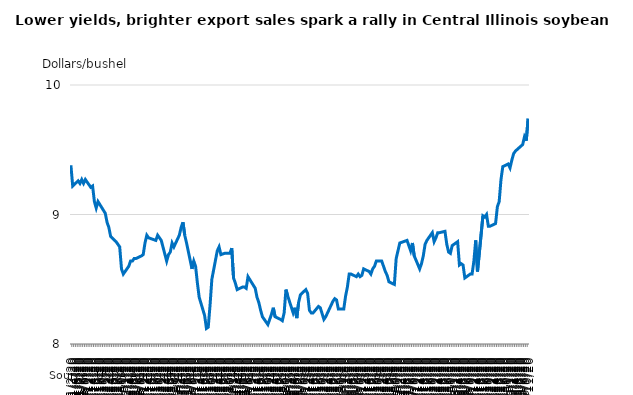
| Category | Series 0 |
|---|---|
| 1/2/20 | 9.38 |
| 1/3/20 | 9.22 |
| 1/6/20 | 9.26 |
| 1/7/20 | 9.24 |
| 1/8/20 | 9.27 |
| 1/9/20 | 9.24 |
| 1/10/20 | 9.27 |
| 1/13/20 | 9.21 |
| 1/14/20 | 9.22 |
| 1/15/20 | 9.1 |
| 1/16/20 | 9.05 |
| 1/17/20 | 9.1 |
| 1/21/20 | 9.01 |
| 1/22/20 | 8.94 |
| 1/23/20 | 8.9 |
| 1/24/20 | 8.83 |
| 1/27/20 | 8.79 |
| 1/28/20 | 8.77 |
| 1/29/20 | 8.75 |
| 1/30/20 | 8.58 |
| 1/31/20 | 8.54 |
| 2/3/20 | 8.6 |
| 2/4/20 | 8.64 |
| 2/5/20 | 8.64 |
| 2/6/20 | 8.66 |
| 2/7/20 | 8.66 |
| 2/10/20 | 8.68 |
| 2/11/20 | 8.69 |
| 2/12/20 | 8.78 |
| 2/13/20 | 8.84 |
| 2/14/20 | 8.82 |
| 2/18/20 | 8.8 |
| 2/19/20 | 8.84 |
| 2/20/20 | 8.82 |
| 2/21/20 | 8.8 |
| 2/24/20 | 8.64 |
| 2/25/20 | 8.69 |
| 2/26/20 | 8.71 |
| 2/27/20 | 8.78 |
| 2/28/20 | 8.75 |
| 3/2/20 | 8.84 |
| 3/3/20 | 8.9 |
| 3/4/20 | 8.94 |
| 3/5/20 | 8.84 |
| 3/6/20 | 8.78 |
| 3/9/20 | 8.58 |
| 3/10/20 | 8.64 |
| 3/11/20 | 8.6 |
| 3/12/20 | 8.47 |
| 3/13/20 | 8.36 |
| 3/16/20 | 8.22 |
| 3/17/20 | 8.12 |
| 3/18/20 | 8.13 |
| 3/19/20 | 8.3 |
| 3/20/20 | 8.5 |
| 3/23/20 | 8.72 |
| 3/24/20 | 8.75 |
| 3/25/20 | 8.69 |
| 3/27/20 | 8.7 |
| 3/30/20 | 8.7 |
| 3/31/20 | 8.74 |
| 4/1/20 | 8.51 |
| 4/2/20 | 8.47 |
| 4/3/20 | 8.42 |
| 4/6/20 | 8.44 |
| 4/7/20 | 8.44 |
| 4/8/20 | 8.43 |
| 4/9/20 | 8.52 |
| 4/13/20 | 8.43 |
| 4/14/20 | 8.36 |
| 4/15/20 | 8.32 |
| 4/16/20 | 8.26 |
| 4/17/20 | 8.21 |
| 4/20/20 | 8.15 |
| 4/21/20 | 8.19 |
| 4/22/20 | 8.23 |
| 4/23/20 | 8.28 |
| 4/24/20 | 8.21 |
| 4/27/20 | 8.19 |
| 4/28/20 | 8.18 |
| 4/29/20 | 8.24 |
| 4/30/20 | 8.42 |
| 5/1/20 | 8.37 |
| 5/4/20 | 8.24 |
| 5/5/20 | 8.28 |
| 5/6/20 | 8.2 |
| 5/7/20 | 8.32 |
| 5/8/20 | 8.38 |
| 5/11/20 | 8.42 |
| 5/12/20 | 8.39 |
| 5/13/20 | 8.26 |
| 5/14/20 | 8.24 |
| 5/15/20 | 8.24 |
| 5/18/20 | 8.29 |
| 5/19/20 | 8.28 |
| 5/21/20 | 8.19 |
| 5/22/20 | 8.21 |
| 5/26/20 | 8.33 |
| 5/27/20 | 8.35 |
| 5/28/20 | 8.34 |
| 5/29/20 | 8.27 |
| 6/1/20 | 8.27 |
| 6/2/20 | 8.37 |
| 6/3/20 | 8.44 |
| 6/4/20 | 8.54 |
| 6/5/20 | 8.54 |
| 6/8/20 | 8.52 |
| 6/9/20 | 8.54 |
| 6/10/20 | 8.52 |
| 6/11/20 | 8.53 |
| 6/12/20 | 8.58 |
| 6/15/20 | 8.56 |
| 6/16/20 | 8.54 |
| 6/17/20 | 8.58 |
| 6/18/20 | 8.6 |
| 6/19/20 | 8.64 |
| 6/22/20 | 8.64 |
| 6/23/20 | 8.6 |
| 6/24/20 | 8.56 |
| 6/25/20 | 8.53 |
| 6/26/20 | 8.48 |
| 6/29/20 | 8.46 |
| 6/30/20 | 8.66 |
| 7/1/20 | 8.72 |
| 7/2/20 | 8.78 |
| 7/6/20 | 8.8 |
| 7/7/20 | 8.76 |
| 7/8/20 | 8.72 |
| 7/9/20 | 8.78 |
| 7/10/20 | 8.68 |
| 7/13/20 | 8.58 |
| 7/14/20 | 8.62 |
| 7/15/20 | 8.68 |
| 7/16/20 | 8.77 |
| 7/17/20 | 8.8 |
| 7/20/20 | 8.86 |
| 7/21/20 | 8.79 |
| 7/22/20 | 8.82 |
| 7/23/20 | 8.86 |
| 7/24/20 | 8.86 |
| 7/27/20 | 8.87 |
| 7/28/20 | 8.77 |
| 7/29/20 | 8.71 |
| 7/30/20 | 8.7 |
| 7/31/20 | 8.76 |
| 8/3/20 | 8.79 |
| 8/4/20 | 8.61 |
| 8/5/20 | 8.62 |
| 8/6/20 | 8.61 |
| 8/7/20 | 8.51 |
| 8/10/20 | 8.54 |
| 8/11/20 | 8.54 |
| 8/12/20 | 8.64 |
| 8/13/20 | 8.8 |
| 8/14/20 | 8.56 |
| 8/17/20 | 8.99 |
| 8/18/20 | 8.98 |
| 8/19/20 | 9 |
| 8/20/20 | 8.91 |
| 8/21/20 | 8.91 |
| 8/24/20 | 8.93 |
| 8/25/20 | 9.06 |
| 8/26/20 | 9.1 |
| 8/27/20 | 9.27 |
| 8/28/20 | 9.37 |
| 8/31/20 | 9.39 |
| 9/1/20 | 9.36 |
| 9/2/20 | 9.42 |
| 9/3/20 | 9.47 |
| 9/4/20 | 9.49 |
| 9/8/20 | 9.54 |
| 9/9/20 | 9.6 |
| 9/10/20 | 9.57 |
| 9/11/20 | 9.74 |